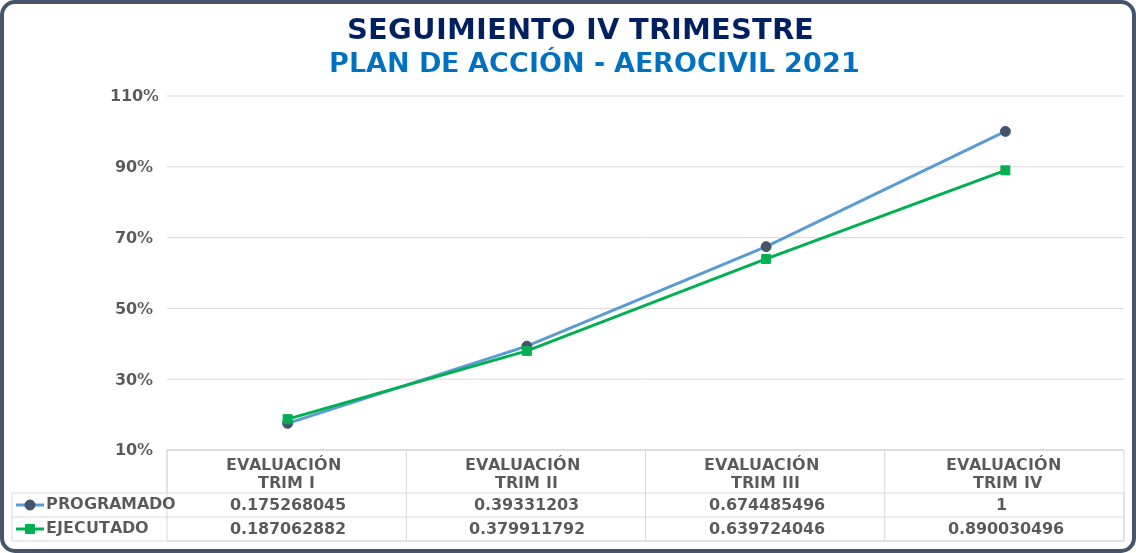
| Category | PROGRAMADO | EJECUTADO |
|---|---|---|
| EVALUACIÓN 
TRIM I | 0.175 | 0.187 |
| EVALUACIÓN 
TRIM II | 0.393 | 0.38 |
| EVALUACIÓN 
TRIM III | 0.674 | 0.64 |
| EVALUACIÓN
 TRIM IV | 1 | 0.89 |